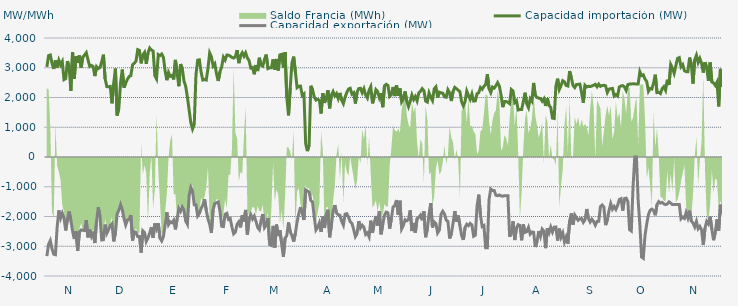
| Category | Capacidad importación (MW) | Capacidad exportación (MW) |
|---|---|---|
| 0 | 3028.417 | -3331.875 |
| 1900-01-01 | 3406.833 | -2936.5 |
| 1900-01-02 | 3428.875 | -2811.25 |
| 1900-01-03 | 3154.208 | -3088.625 |
| 1900-01-04 | 2961.542 | -3268.083 |
| 1900-01-05 | 3246.75 | -3285.125 |
| 1900-01-06 | 2998.792 | -2359.333 |
| 1900-01-07 | 3250.625 | -1795.833 |
| 1900-01-08 | 3098.083 | -2058.458 |
| 1900-01-09 | 3208.458 | -1889.583 |
| 1900-01-10 | 2600.833 | -2050 |
| 1900-01-11 | 2636.458 | -2468.208 |
| 1900-01-12 | 3221.75 | -2100 |
| 1900-01-13 | 3030.917 | -1831.25 |
| 1900-01-14 | 2221.417 | -2127.083 |
| 1900-01-15 | 3529.833 | -2490.5 |
| 1900-01-16 | 2631.583 | -2756.25 |
| 1900-01-17 | 3389.417 | -2493.667 |
| 1900-01-18 | 3161.917 | -3158.375 |
| 1900-01-19 | 3412.417 | -2518.792 |
| 1900-01-20 | 3004.917 | -2450.333 |
| 1900-01-21 | 3360.75 | -2463.25 |
| 1900-01-22 | 3427.958 | -2474.292 |
| 1900-01-23 | 3506.917 | -2123.5 |
| 1900-01-24 | 3269.708 | -2701.708 |
| 1900-01-25 | 3043.333 | -2440.417 |
| 1900-01-26 | 3078.833 | -2660.667 |
| 1900-01-27 | 3042.542 | -2510.25 |
| 1900-01-28 | 2720.083 | -2892.208 |
| 1900-01-29 | 3035.792 | -2156.833 |
| 1900-01-30 | 2973.125 | -1691.667 |
| 1900-01-31 | 3008.708 | -2006.25 |
| 1900-02-01 | 3198.417 | -2788.271 |
| 1900-02-02 | 3439.5 | -2780.875 |
| 1900-02-03 | 2626.625 | -2273 |
| 1900-02-04 | 2364.583 | -2564.167 |
| 1900-02-05 | 2360.417 | -2440.708 |
| 1900-02-06 | 2372.917 | -2302.125 |
| 1900-02-07 | 1804.167 | -2241.25 |
| 1900-02-08 | 2476.875 | -2836.292 |
| 1900-02-09 | 2972.208 | -2552.292 |
| 1900-02-10 | 1394.917 | -1922 |
| 1900-02-11 | 1635.417 | -1780.667 |
| 1900-02-12 | 2487.208 | -1602.083 |
| 1900-02-13 | 2938.333 | -1770.833 |
| 1900-02-14 | 2333.708 | -2058.75 |
| 1900-02-15 | 2480.333 | -2280.5 |
| 1900-02-16 | 2612.458 | -2120.333 |
| 1900-02-17 | 2705.792 | -2095.25 |
| 1900-02-18 | 2735.375 | -1951.833 |
| 1900-02-19 | 3100.375 | -2807.583 |
| 1900-02-20 | 3154.125 | -2514.417 |
| 1900-02-21 | 3216.042 | -2530.208 |
| 1900-02-22 | 3609.167 | -2672.875 |
| 1900-02-23 | 3585.958 | -2674.5 |
| 1900-02-24 | 3148.417 | -3214.25 |
| 1900-02-25 | 3433.542 | -2480.667 |
| 1900-02-26 | 3518.5 | -2539.5 |
| 1900-02-27 | 3130.292 | -2838.583 |
| 1900-02-28 | 3499.167 | -2718.417 |
| 1900-02-28 | 3663.042 | -2554.083 |
| 1900-03-01 | 3596.708 | -2355.75 |
| 1900-03-02 | 3562.792 | -2716.417 |
| 1900-03-03 | 2738.75 | -2235.333 |
| 1900-03-04 | 2625.667 | -2410 |
| 1900-03-05 | 3444.083 | -2226.333 |
| 1900-03-06 | 3408.75 | -2728 |
| 1900-03-07 | 3460.583 | -2820.25 |
| 1900-03-08 | 3350.75 | -2676.083 |
| 1900-03-09 | 2899.917 | -2289.583 |
| 1900-03-10 | 2581.708 | -1858.083 |
| 1900-03-11 | 2842.042 | -2272.417 |
| 1900-03-12 | 2711.125 | -2177.417 |
| 1900-03-13 | 2740.458 | -2209.667 |
| 1900-03-14 | 2608.583 | -2127.083 |
| 1900-03-15 | 3264.042 | -2433.083 |
| 1900-03-16 | 2836.375 | -2085.417 |
| 1900-03-17 | 2379.792 | -1727.083 |
| 1900-03-18 | 3123.25 | -1827.083 |
| 1900-03-19 | 2982.792 | -1681.25 |
| 1900-03-20 | 2556.667 | -1789.667 |
| 1900-03-21 | 2375.667 | -2149.333 |
| 1900-03-22 | 2017.208 | -2261.458 |
| 1900-03-23 | 1585 | -1297.917 |
| 1900-03-24 | 1154.167 | -1022.917 |
| 1900-03-25 | 939.583 | -1143.75 |
| 1900-03-26 | 1093.75 | -1604.167 |
| 1900-03-27 | 2763.333 | -1604.167 |
| 1900-03-28 | 3256.375 | -1980.875 |
| 1900-03-29 | 3265.958 | -1897.917 |
| 1900-03-30 | 2849.625 | -1726.333 |
| 1900-03-31 | 2586.542 | -1614.583 |
| 1900-04-01 | 2607.375 | -1416.667 |
| 1900-04-02 | 2587.208 | -1789.583 |
| 1900-04-03 | 2978.5 | -2081.25 |
| 1900-04-04 | 3497.083 | -2256.292 |
| 1900-04-05 | 3370 | -2554.542 |
| 1900-04-06 | 3061.75 | -1771.917 |
| 1900-04-07 | 3134.875 | -1562.5 |
| 1900-04-08 | 2789.5 | -1537.5 |
| 1900-04-09 | 2555.75 | -1512.5 |
| 1900-04-10 | 2867.083 | -1825 |
| 1900-04-11 | 3026.833 | -2326.458 |
| 1900-04-12 | 3354.833 | -2337.292 |
| 1900-04-13 | 3258.292 | -1924.167 |
| 1900-04-14 | 3426.125 | -1893.75 |
| 1900-04-15 | 3424.167 | -2100 |
| 1900-04-16 | 3391.208 | -2070.833 |
| 1900-04-17 | 3348.208 | -2362.208 |
| 1900-04-18 | 3325.958 | -2584.917 |
| 1900-04-19 | 3372.292 | -2526.125 |
| 1900-04-20 | 3594.458 | -2261.833 |
| 1900-04-21 | 3154.208 | -2177.542 |
| 1900-04-22 | 3406.542 | -2366 |
| 1900-04-23 | 3506.792 | -1962 |
| 1900-04-24 | 3388.292 | -2170.833 |
| 1900-04-25 | 3502.625 | -1778.917 |
| 1900-04-26 | 3329.875 | -2606.583 |
| 1900-04-27 | 3238.958 | -2081.917 |
| 1900-04-28 | 2990.542 | -1937.25 |
| 1900-04-29 | 3009.542 | -2084.208 |
| 1900-04-30 | 2780.333 | -1987.25 |
| 1900-05-01 | 3090.792 | -2157.25 |
| 1900-05-02 | 2889.375 | -2369.167 |
| 1900-05-03 | 3335.375 | -2443.917 |
| 1900-05-04 | 3086.625 | -2135.417 |
| 1900-05-05 | 3054 | -1916.417 |
| 1900-05-06 | 3285.417 | -2373 |
| 1900-05-07 | 3443.292 | -2289.333 |
| 1900-05-08 | 2971.208 | -2047.917 |
| 1900-05-09 | 2996.292 | -2944.458 |
| 1900-05-10 | 3001.167 | -2971.542 |
| 1900-05-11 | 3281.375 | -2314.833 |
| 1900-05-12 | 2936.042 | -3043.167 |
| 1900-05-13 | 3294.792 | -2270.333 |
| 1900-05-14 | 2907.375 | -2657.667 |
| 1900-05-15 | 3433.583 | -2462.5 |
| 1900-05-16 | 3449.042 | -2914.583 |
| 1900-05-17 | 2992.458 | -3358.458 |
| 1900-05-18 | 3524.375 | -2728.208 |
| 1900-05-19 | 2000 | -2643.375 |
| 1900-05-20 | 1400 | -2200 |
| 1900-05-21 | 2323.375 | -2514.75 |
| 1900-05-22 | 3160.167 | -2645.333 |
| 1900-05-23 | 3372.083 | -2842.167 |
| 1900-05-24 | 2865.739 | -2564.565 |
| 1900-05-25 | 2332.667 | -2181.833 |
| 1900-05-26 | 2376.083 | -1906.25 |
| 1900-05-27 | 2381.25 | -1683.333 |
| 1900-05-28 | 2070.833 | -1891.667 |
| 1900-05-29 | 2120.083 | -2118.75 |
| 1900-05-30 | 449.25 | -1108.333 |
| 1900-05-31 | 200 | -1139.583 |
| 1900-06-01 | 395.833 | -1179.167 |
| 1900-06-02 | 2393.75 | -1462.5 |
| 1900-06-03 | 2262.25 | -1512.5 |
| 1900-06-04 | 2020.833 | -2007.167 |
| 1900-06-05 | 1912.5 | -2455.208 |
| 1900-06-06 | 1939.583 | -2371.125 |
| 1900-06-07 | 1908.333 | -2217.958 |
| 1900-06-08 | 1462.5 | -2517.542 |
| 1900-06-09 | 2145.208 | -2000.417 |
| 1900-06-10 | 1820.833 | -2386.167 |
| 1900-06-11 | 1983.333 | -1930.75 |
| 1900-06-12 | 2245.833 | -1772.917 |
| 1900-06-13 | 1635.417 | -2697.5 |
| 1900-06-14 | 2079.167 | -2299.625 |
| 1900-06-15 | 2200 | -1818.75 |
| 1900-06-16 | 2052.083 | -1616.667 |
| 1900-06-17 | 2133.333 | -1885.417 |
| 1900-06-18 | 1962.5 | -1940.792 |
| 1900-06-19 | 2154.167 | -1955.875 |
| 1900-06-20 | 1906.25 | -2160.458 |
| 1900-06-21 | 1791.667 | -2289.583 |
| 1900-06-22 | 2014.583 | -1920.333 |
| 1900-06-23 | 2166.667 | -1904.167 |
| 1900-06-24 | 2285.417 | -2016.25 |
| 1900-06-25 | 2310.417 | -2177.917 |
| 1900-06-26 | 2114.583 | -2230.875 |
| 1900-06-27 | 2160.417 | -2431.625 |
| 1900-06-28 | 1797.917 | -2674.417 |
| 1900-06-29 | 2180.625 | -2574 |
| 1900-06-30 | 2300 | -2155.333 |
| 1900-07-01 | 2310.417 | -2380.708 |
| 1900-07-02 | 2160.417 | -2290.5 |
| 1900-07-03 | 2295.833 | -2360.958 |
| 1900-07-04 | 2083.333 | -2603 |
| 1900-07-05 | 1983.333 | -2551.458 |
| 1900-07-06 | 2243.75 | -2680.375 |
| 1900-07-07 | 2364.583 | -2139.583 |
| 1900-07-08 | 1802.083 | -2551.375 |
| 1900-07-09 | 2012.5 | -2222.583 |
| 1900-07-10 | 2264.583 | -1983.333 |
| 1900-07-11 | 2200 | -2304.167 |
| 1900-07-12 | 1991.667 | -1823 |
| 1900-07-13 | 2139.583 | -2598.667 |
| 1900-07-14 | 1674.583 | -2262.5 |
| 1900-07-15 | 2391.667 | -1958.333 |
| 1900-07-16 | 2442.875 | -1852.083 |
| 1900-07-17 | 2406.25 | -1879.167 |
| 1900-07-18 | 2035.417 | -2408.5 |
| 1900-07-19 | 2093.75 | -2077.083 |
| 1900-07-20 | 2353.042 | -1679.167 |
| 1900-07-21 | 2047.917 | -1637.5 |
| 1900-07-22 | 2414.917 | -1445.833 |
| 1900-07-23 | 2054.167 | -1935.417 |
| 1900-07-24 | 2304.167 | -1468.75 |
| 1900-07-25 | 1852.083 | -2413.583 |
| 1900-07-26 | 1950 | -2298.583 |
| 1900-07-27 | 2204.167 | -2108.333 |
| 1900-07-28 | 1870.833 | -2142.875 |
| 1900-07-29 | 1693.75 | -2094.083 |
| 1900-07-30 | 1875 | -1793.75 |
| 1900-07-31 | 2087.5 | -2489.25 |
| 1900-08-01 | 1929.167 | -2216.167 |
| 1900-08-02 | 2031.25 | -2542 |
| 1900-08-03 | 1885.417 | -2072.833 |
| 1900-08-04 | 2156.25 | -2029.167 |
| 1900-08-05 | 2208.333 | -1953 |
| 1900-08-06 | 2297.917 | -2127.083 |
| 1900-08-07 | 2229.167 | -1822.917 |
| 1900-08-08 | 1879.167 | -2695.583 |
| 1900-08-09 | 1845.833 | -2427.667 |
| 1900-08-10 | 2156.25 | -1908.417 |
| 1900-08-11 | 2010.417 | -1551.375 |
| 1900-08-12 | 1897.625 | -2367.333 |
| 1900-08-13 | 2291.667 | -2179.167 |
| 1900-08-14 | 2358.333 | -2236.833 |
| 1900-08-15 | 1997.917 | -2551.708 |
| 1900-08-16 | 2179.167 | -2457.875 |
| 1900-08-17 | 2156.25 | -1922.667 |
| 1900-08-18 | 2145.833 | -1823.917 |
| 1900-08-19 | 2022.917 | -1916.417 |
| 1900-08-20 | 2008.333 | -2121.167 |
| 1900-08-21 | 2260.417 | -2164.667 |
| 1900-08-22 | 2152.083 | -2739.958 |
| 1900-08-23 | 1881 | -2582.833 |
| 1900-08-24 | 2206.25 | -2222.083 |
| 1900-08-25 | 2339.583 | -1816.667 |
| 1900-08-26 | 2293.75 | -2177.833 |
| 1900-08-27 | 2245.833 | -1968.75 |
| 1900-08-28 | 2195.833 | -2304.458 |
| 1900-08-29 | 1858.208 | -2638.917 |
| 1900-08-30 | 1718.75 | -2788.083 |
| 1900-08-31 | 1858.333 | -2369.542 |
| 1900-09-01 | 2216.667 | -2260.583 |
| 1900-09-02 | 2066.667 | -2309.375 |
| 1900-09-03 | 1935.417 | -2231 |
| 1900-09-04 | 2118.292 | -2285.25 |
| 1900-09-05 | 1879.583 | -2663 |
| 1900-09-06 | 1887.5 | -2627.5 |
| 1900-09-07 | 2127.083 | -1647.917 |
| 1900-09-08 | 2162.5 | -1266.667 |
| 1900-09-09 | 2338.667 | -1964.583 |
| 1900-09-10 | 2277.083 | -2337.25 |
| 1900-09-11 | 2373.75 | -2304.167 |
| 1900-09-12 | 2435.083 | -3048.333 |
| 1900-09-13 | 2780.708 | -3048.208 |
| 1900-09-14 | 2300 | -1435 |
| 1900-09-15 | 2164.583 | -1077.083 |
| 1900-09-16 | 2350 | -1125 |
| 1900-09-17 | 2314.583 | -1125 |
| 1900-09-18 | 2395.625 | -1287.5 |
| 1900-09-19 | 2501.583 | -1302.083 |
| 1900-09-20 | 2389.417 | -1275 |
| 1900-09-21 | 2080.375 | -1308.333 |
| 1900-09-22 | 1675 | -1316.667 |
| 1900-09-23 | 1862.5 | -1300 |
| 1900-09-24 | 1866.708 | -1300 |
| 1900-09-25 | 1837.292 | -1300 |
| 1900-09-26 | 1793.75 | -2680.333 |
| 1900-09-27 | 2268.333 | -2563.75 |
| 1900-09-28 | 2217.333 | -2160.333 |
| 1900-09-29 | 1831.25 | -2791.75 |
| 1900-09-30 | 1890.083 | -2386.583 |
| 1900-10-01 | 1581.667 | -2273.25 |
| 1900-10-02 | 1595.833 | -2304.167 |
| 1900-10-03 | 1593.75 | -2799.042 |
| 1900-10-04 | 1860.75 | -2268.667 |
| 1900-10-05 | 2160.5 | -2533.875 |
| 1900-10-06 | 1785.417 | -2508.667 |
| 1900-10-07 | 1658.333 | -2368.167 |
| 1900-10-08 | 1958.333 | -2590.5 |
| 1900-10-09 | 1875.083 | -2522 |
| 1900-10-10 | 2489.792 | -2532.75 |
| 1900-10-11 | 2064.583 | -3024.833 |
| 1900-10-12 | 2001.333 | -2838.125 |
| 1900-10-13 | 1979.167 | -2490.417 |
| 1900-10-14 | 1966.667 | -2671.375 |
| 1900-10-15 | 1877.792 | -2424.333 |
| 1900-10-16 | 1957.75 | -2493.167 |
| 1900-10-17 | 1716.667 | -3063.708 |
| 1900-10-18 | 1978.5 | -2394.708 |
| 1900-10-19 | 1729.167 | -2549 |
| 1900-10-20 | 1666.667 | -2355.5 |
| 1900-10-21 | 1308.333 | -2520.458 |
| 1900-10-22 | 1293.75 | -2359.417 |
| 1900-10-23 | 2383.833 | -2353.167 |
| 1900-10-24 | 2632.25 | -2807.083 |
| 1900-10-25 | 2269.167 | -2407.042 |
| 1900-10-26 | 2400.75 | -2695.042 |
| 1900-10-27 | 2564.417 | -2553.583 |
| 1900-10-28 | 2525.583 | -2853.583 |
| 1900-10-29 | 2404.5 | -2690.292 |
| 1900-10-30 | 2386.042 | -2912.083 |
| 1900-10-31 | 2890.042 | -2155.708 |
| 1900-11-01 | 2668.625 | -1896.5 |
| 1900-11-02 | 2403.083 | -2272.75 |
| 1900-11-03 | 2332.833 | -1950 |
| 1900-11-04 | 2437.5 | -2037.5 |
| 1900-11-05 | 2441.667 | -2129 |
| 1900-11-06 | 2450 | -2079.167 |
| 1900-11-07 | 2159.292 | -2066.667 |
| 1900-11-08 | 1825 | -2195.667 |
| 1900-11-09 | 2412.5 | -2108.333 |
| 1900-11-10 | 2355.5 | -1747.917 |
| 1900-11-11 | 2377.083 | -2070.833 |
| 1900-11-12 | 2366.667 | -2185.333 |
| 1900-11-13 | 2387.5 | -2091.667 |
| 1900-11-14 | 2412.5 | -2164.583 |
| 1900-11-15 | 2443 | -2291.292 |
| 1900-11-16 | 2360.417 | -2168.75 |
| 1900-11-17 | 2450 | -2160.417 |
| 1900-11-18 | 2375 | -1668.75 |
| 1900-11-19 | 2402.083 | -1612.5 |
| 1900-11-20 | 2412 | -1683.333 |
| 1900-11-21 | 2393.75 | -2289.583 |
| 1900-11-22 | 2168.625 | -2114.083 |
| 1900-11-23 | 2281.25 | -1800 |
| 1900-11-24 | 2295.833 | -1566.667 |
| 1900-11-25 | 2306.25 | -1754.167 |
| 1900-11-26 | 2050 | -1662.5 |
| 1900-11-27 | 2100 | -1762.5 |
| 1900-11-28 | 2052.083 | -1629.167 |
| 1900-11-29 | 2351.708 | -1429.167 |
| 1900-11-30 | 2387.5 | -1400 |
| 1900-12-01 | 2400 | -1800 |
| 1900-12-02 | 2355.875 | -1400 |
| 1900-12-03 | 2239.583 | -1383.333 |
| 1900-12-04 | 2435.417 | -1500 |
| 1900-12-05 | 2450 | -2442.875 |
| 1900-12-06 | 2455.875 | -2487.042 |
| 1900-12-07 | 2459.792 | -1025 |
| 1900-12-08 | 2457.708 | 0 |
| 1900-12-09 | 2450 | 0 |
| 1900-12-10 | 2450 | -1462.5 |
| 1900-12-11 | 2870.833 | -2280.5 |
| 1900-12-12 | 2735.958 | -3362.458 |
| 1900-12-13 | 2761.833 | -3404.708 |
| 1900-12-14 | 2618.708 | -2638.958 |
| 1900-12-15 | 2538.583 | -2247.25 |
| 1900-12-16 | 2208.333 | -1933.333 |
| 1900-12-17 | 2304.167 | -1791.667 |
| 1900-12-18 | 2285.083 | -1750 |
| 1900-12-19 | 2485.708 | -1800 |
| 1900-12-20 | 2766.917 | -1958.333 |
| 1900-12-21 | 2164.458 | -1600 |
| 1900-12-22 | 2172.792 | -1500 |
| 1900-12-23 | 2133.333 | -1550 |
| 1900-12-24 | 2297.917 | -1525 |
| 1900-12-25 | 2366.667 | -1575 |
| 1900-12-26 | 2243.25 | -1600 |
| 1900-12-27 | 2598.52 | -1580 |
| 1900-12-28 | 2420.167 | -1508.333 |
| 1900-12-29 | 3106.25 | -1550 |
| 1900-12-30 | 2984.667 | -1600 |
| 1900-12-31 | 2812.083 | -1600 |
| 1901-01-01 | 3067.5 | -1600 |
| 1901-01-02 | 3316.25 | -1600 |
| 1901-01-03 | 3341.25 | -1600 |
| 1901-01-04 | 3032 | -2077.083 |
| 1901-01-05 | 3104.417 | -2016.75 |
| 1901-01-06 | 2900 | -2064.583 |
| 1901-01-07 | 2867 | -1862.5 |
| 1901-01-08 | 2867 | -2045.833 |
| 1901-01-09 | 3341.083 | -1804.167 |
| 1901-01-10 | 3131.083 | -2154.167 |
| 1901-01-11 | 2468.083 | -2216.667 |
| 1901-01-12 | 3265.167 | -2350 |
| 1901-01-13 | 3420.583 | -2164.833 |
| 1901-01-14 | 3174.333 | -2409.417 |
| 1901-01-15 | 3313.292 | -2335.75 |
| 1901-01-16 | 3146.333 | -2455.542 |
| 1901-01-17 | 2838 | -2955.75 |
| 1901-01-18 | 3188.5 | -2388.25 |
| 1901-01-19 | 2992.083 | -2162.5 |
| 1901-01-20 | 2556.125 | -2248.583 |
| 1901-01-21 | 3177.25 | -2002.917 |
| 1901-01-22 | 2521.083 | -2429.667 |
| 1901-01-23 | 2489.167 | -2797.208 |
| 1901-01-24 | 2404.583 | -2531.417 |
| 1901-01-25 | 2519.708 | -2094.75 |
| 1901-01-26 | 1700 | -2472.792 |
| 1901-01-27 | 2961.583 | -1602.083 |
| 1901-01-28 | 2367.125 | -1916.667 |